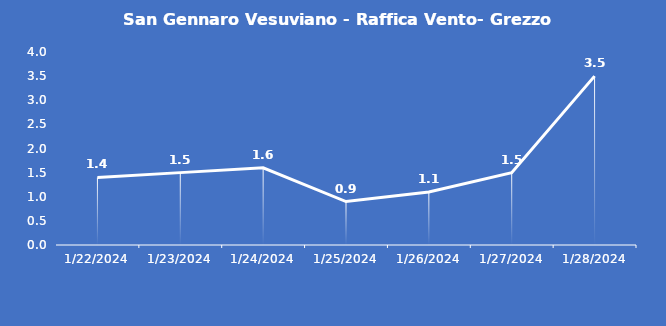
| Category | San Gennaro Vesuviano - Raffica Vento- Grezzo (m/s) |
|---|---|
| 1/22/24 | 1.4 |
| 1/23/24 | 1.5 |
| 1/24/24 | 1.6 |
| 1/25/24 | 0.9 |
| 1/26/24 | 1.1 |
| 1/27/24 | 1.5 |
| 1/28/24 | 3.5 |